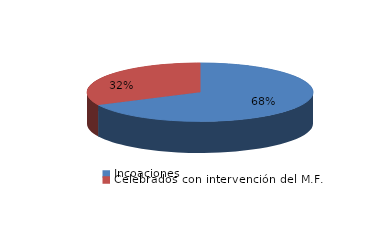
| Category | Series 0 |
|---|---|
| Incoaciones | 10114 |
| Celebrados con intervención del M.F. | 4807 |